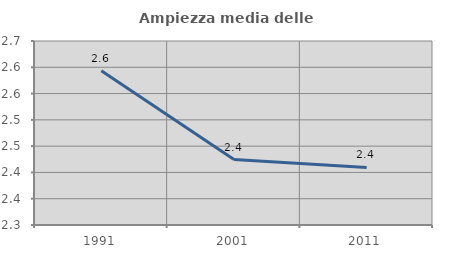
| Category | Ampiezza media delle famiglie |
|---|---|
| 1991.0 | 2.594 |
| 2001.0 | 2.424 |
| 2011.0 | 2.409 |